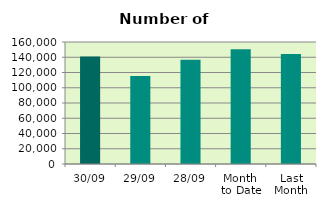
| Category | Series 0 |
|---|---|
| 30/09 | 141024 |
| 29/09 | 115306 |
| 28/09 | 136578 |
| Month 
to Date | 150562.364 |
| Last
Month | 144368.095 |